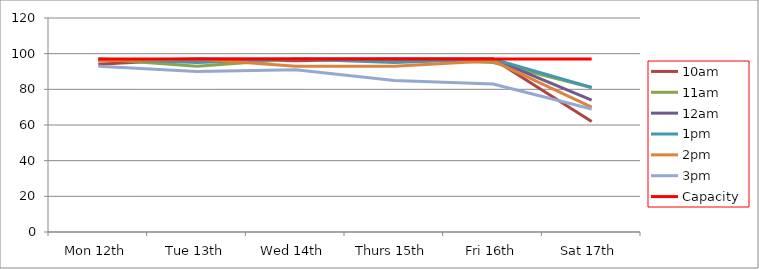
| Category | 9am | 10am | 11am | 12am | 1pm | 2pm | 3pm | 4pm | 5pm | Capacity |
|---|---|---|---|---|---|---|---|---|---|---|
| Mon 12th |  | 94 | 97 | 96 | 97 | 96 | 93 |  |  | 97 |
| Tue 13th |  | 97 | 93 | 97 | 95 | 97 | 90 |  |  | 97 |
| Wed 14th |  | 96 | 97 | 97 | 97 | 93 | 91 |  |  | 97 |
| Thurs 15th |  | 97 | 97 | 97 | 95 | 93 | 85 |  |  | 97 |
| Fri 16th |  | 97 | 95 | 97 | 97 | 96 | 83 |  |  | 97 |
| Sat 17th |  | 62 | 81 | 74 | 81 | 70 | 69 |  |  | 97 |